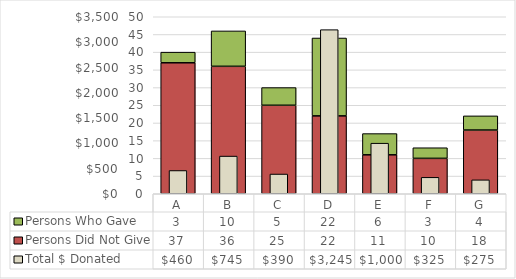
| Category | Persons Did Not Give | Persons Who Gave |
|---|---|---|
| A | 37 | 3 |
| B | 36 | 10 |
| C | 25 | 5 |
| D | 22 | 22 |
| E | 11 | 6 |
| F | 10 | 3 |
| G | 18 | 4 |